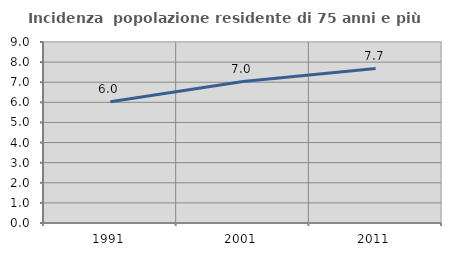
| Category | Incidenza  popolazione residente di 75 anni e più |
|---|---|
| 1991.0 | 6.032 |
| 2001.0 | 7.033 |
| 2011.0 | 7.68 |